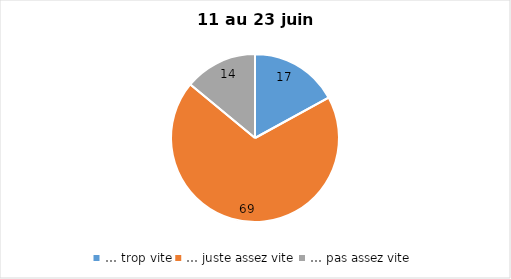
| Category | Series 0 |
|---|---|
| … trop vite | 17 |
| … juste assez vite | 69 |
| … pas assez vite | 14 |